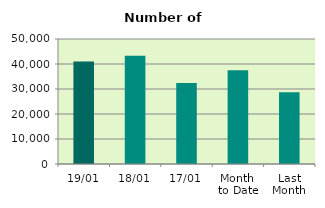
| Category | Series 0 |
|---|---|
| 19/01 | 40972 |
| 18/01 | 43326 |
| 17/01 | 32436 |
| Month 
to Date | 37537.077 |
| Last
Month | 28724.435 |